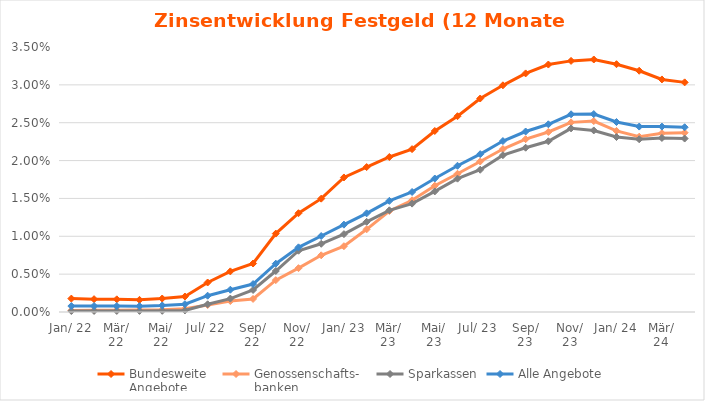
| Category | Bundesweite
Angebote | Genossenschafts-
banken | Sparkassen | Alle Angebote |
|---|---|---|---|---|
| Jan. 22 | 0.002 | 0 | 0 | 0.001 |
| Feb. 22 | 0.002 | 0 | 0 | 0.001 |
| Mrz. 22 | 0.002 | 0 | 0 | 0.001 |
| Apr. 22 | 0.002 | 0 | 0 | 0.001 |
| Mai. 22 | 0.002 | 0 | 0 | 0.001 |
| Jun. 22 | 0.002 | 0 | 0 | 0.001 |
| Jul. 22 | 0.004 | 0.001 | 0.001 | 0.002 |
| Aug. 22 | 0.005 | 0.001 | 0.002 | 0.003 |
| Sep. 22 | 0.006 | 0.002 | 0.003 | 0.004 |
| Okt. 22 | 0.01 | 0.004 | 0.005 | 0.006 |
| Nov. 22 | 0.013 | 0.006 | 0.008 | 0.009 |
| Dez. 22 | 0.015 | 0.007 | 0.009 | 0.01 |
| Jan. 23 | 0.018 | 0.009 | 0.01 | 0.012 |
| Feb. 23 | 0.019 | 0.011 | 0.012 | 0.013 |
| Mrz. 23 | 0.02 | 0.013 | 0.013 | 0.015 |
| Apr. 23 | 0.022 | 0.015 | 0.014 | 0.016 |
| Mai. 23 | 0.024 | 0.017 | 0.016 | 0.018 |
| Jun. 23 | 0.026 | 0.018 | 0.018 | 0.019 |
| Jul. 23 | 0.028 | 0.02 | 0.019 | 0.021 |
| Aug. 23 | 0.03 | 0.022 | 0.021 | 0.023 |
| Sep. 23 | 0.032 | 0.023 | 0.022 | 0.024 |
| Okt. 23 | 0.033 | 0.024 | 0.023 | 0.025 |
| Nov. 23 | 0.033 | 0.025 | 0.024 | 0.026 |
| Dez. 23 | 0.033 | 0.025 | 0.024 | 0.026 |
| Jan. 24 | 0.033 | 0.024 | 0.023 | 0.025 |
| Feb. 24 | 0.032 | 0.023 | 0.023 | 0.024 |
| Mrz. 24 | 0.031 | 0.024 | 0.023 | 0.024 |
| Akt. | 0.03 | 0.024 | 0.023 | 0.024 |